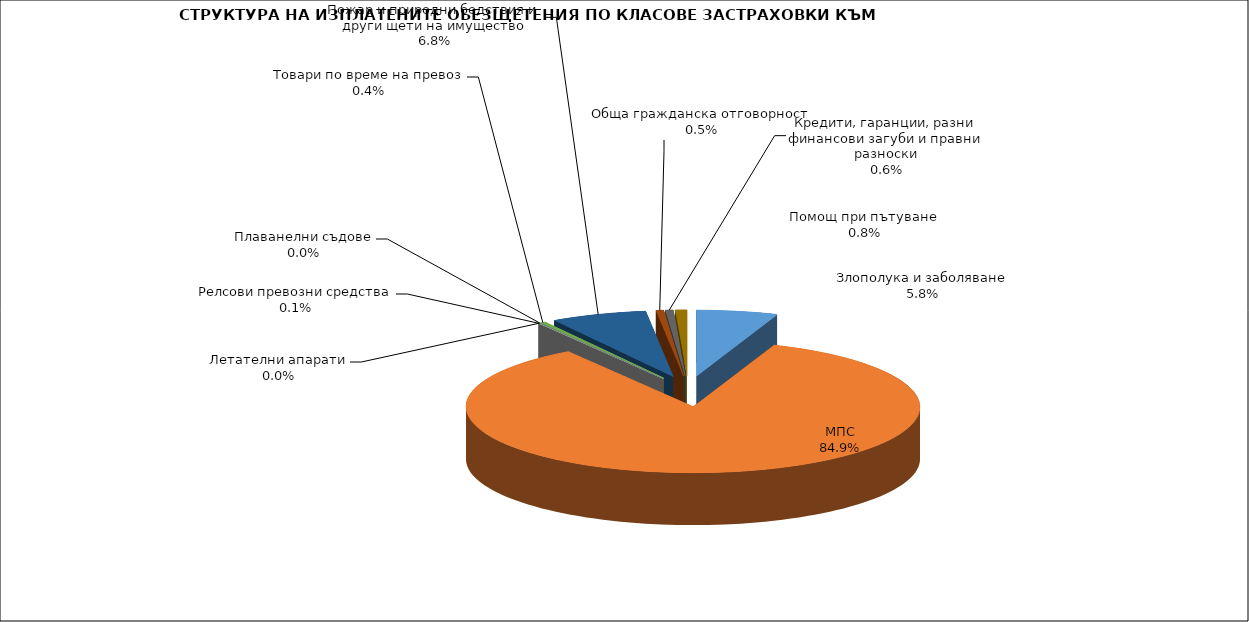
| Category | Series 0 |
|---|---|
| Злополука и заболяване | 0.058 |
| МПС | 0.849 |
| Релсови превозни средства | 0.001 |
| Летателни апарати | 0 |
| Плаванелни съдове | 0 |
| Товари по време на превоз | 0.004 |
| Пожар и природни бедствия и други щети на имущество | 0.068 |
| Обща гражданска отговорност | 0.005 |
| Кредити, гаранции, разни финансови загуби и правни разноски | 0.006 |
| Помощ при пътуване | 0.008 |